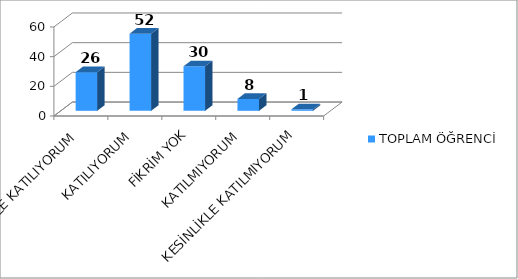
| Category | TOPLAM ÖĞRENCİ |
|---|---|
| KESİNLİKLE KATILIYORUM | 26 |
| KATILIYORUM | 52 |
| FİKRİM YOK | 30 |
| KATILMIYORUM | 8 |
| KESİNLİKLE KATILMIYORUM | 1 |